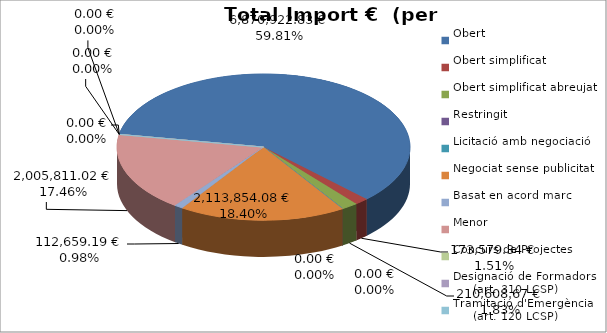
| Category | Total preu
(amb IVA) |
|---|---|
| Obert | 6870922.83 |
| Obert simplificat | 173579.34 |
| Obert simplificat abreujat | 210608.67 |
| Restringit | 0 |
| Licitació amb negociació | 0 |
| Negociat sense publicitat | 2113854.08 |
| Basat en acord marc | 112659.19 |
| Menor | 2005811.02 |
| Concurs de Projectes | 0 |
| Designació de Formadors
     (art. 310 LCSP) | 0 |
| Tramitació d'Emergència
     (art. 120 LCSP) | 0 |